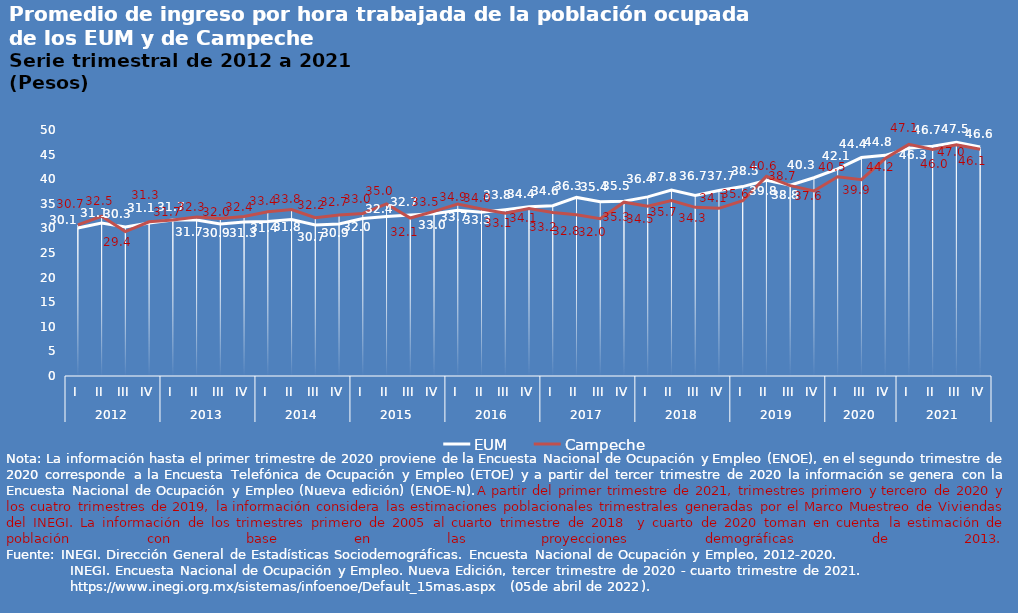
| Category | EUM | Campeche |
|---|---|---|
| 0 | 30.1 | 30.7 |
| 1 | 31.1 | 32.469 |
| 2 | 30.3 | 29.361 |
| 3 | 31.1 | 31.344 |
| 4 | 31.7 | 31.717 |
| 5 | 31.7 | 32.298 |
| 6 | 30.9 | 32.021 |
| 7 | 31.3 | 32.405 |
| 8 | 31.4 | 33.394 |
| 9 | 31.8 | 33.838 |
| 10 | 30.7 | 32.185 |
| 11 | 30.9 | 32.726 |
| 12 | 32 | 33.039 |
| 13 | 32.4 | 34.973 |
| 14 | 32.7 | 32.104 |
| 15 | 33 | 33.457 |
| 16 | 33.7 | 34.937 |
| 17 | 33.3 | 33.961 |
| 18 | 33.8 | 33.099 |
| 19 | 34.4 | 34.057 |
| 20 | 34.6 | 33.241 |
| 21 | 36.3 | 32.777 |
| 22 | 35.4 | 31.96 |
| 23 | 35.5 | 35.332 |
| 24 | 36.4 | 34.51 |
| 25 | 37.8 | 35.652 |
| 26 | 36.7 | 34.282 |
| 27 | 37.7 | 34.082 |
| 28 | 38.5 | 35.613 |
| 29 | 39.8 | 40.577 |
| 30 | 38.8 | 38.696 |
| 31 | 40.3 | 37.6 |
| 32 | 42.1 | 40.5 |
| 33 | 44.4 | 39.9 |
| 34 | 44.847 | 44.191 |
| 35 | 46.3 | 47.077 |
| 36 | 46.7 | 46.031 |
| 37 | 47.5 | 46.976 |
| 38 | 46.557 | 46.104 |